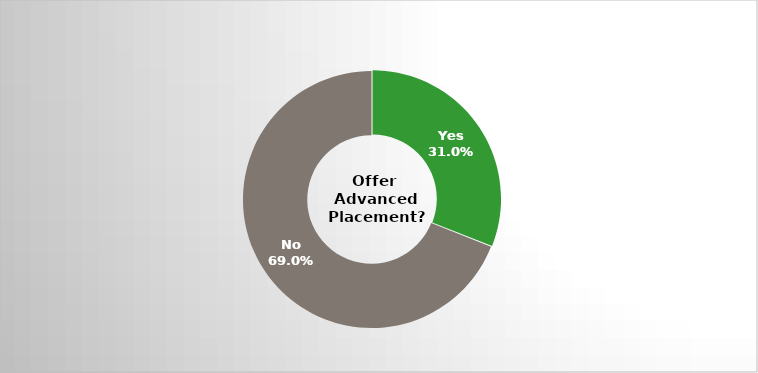
| Category | Series 0 |
|---|---|
| Yes | 0.31 |
| No | 0.69 |